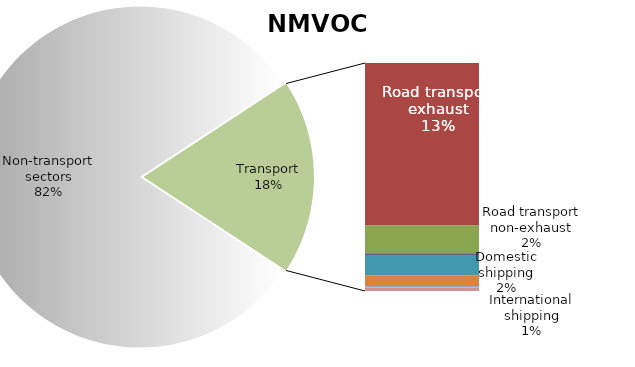
| Category | Series 0 |
|---|---|
| Non-transport sectors | 6901.285 |
| Road transport exhaust | 1113.592 |
| Road transport non-exhaust | 190.187 |
| Railways | 11.867 |
| Domestic shipping | 138.72 |
| International shipping | 74.478 |
| Domestic aviation | 9.145 |
| International aviation | 24.476 |